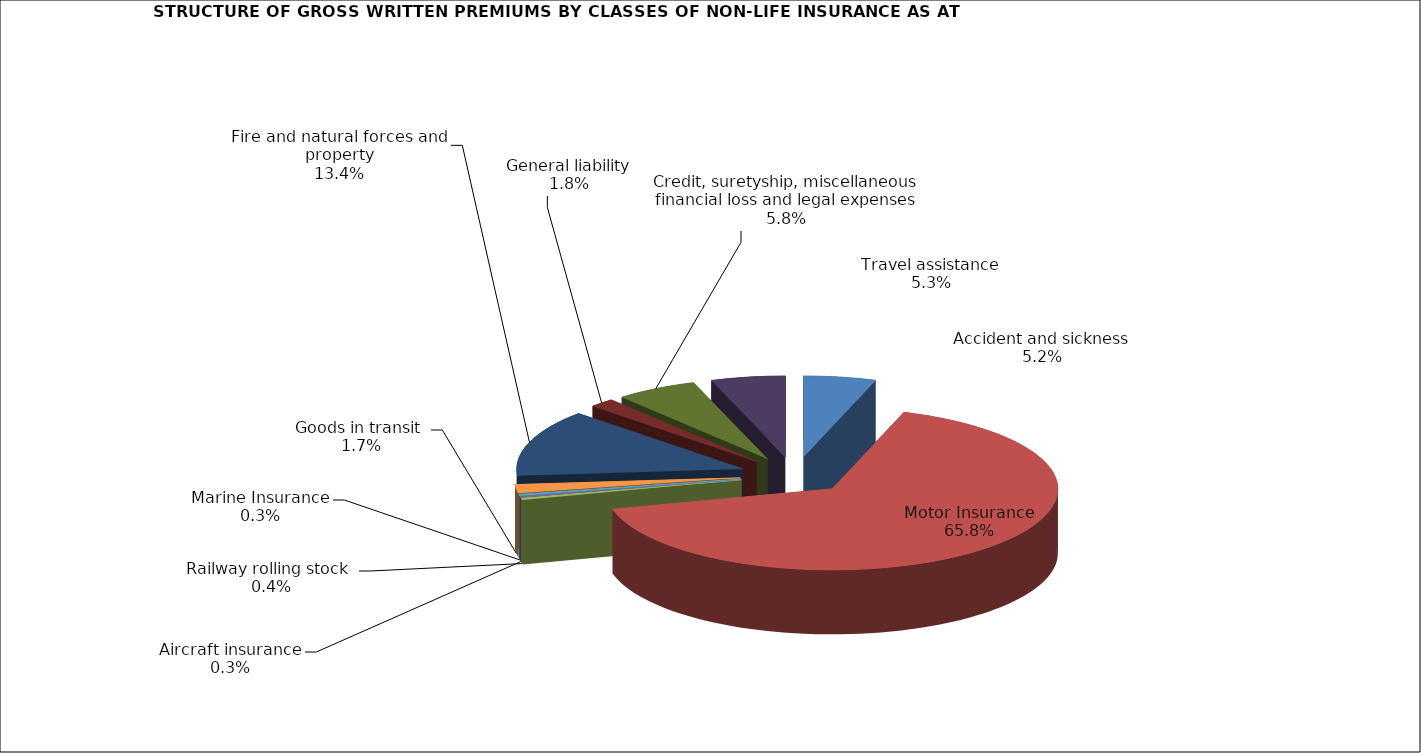
| Category | Accident and sickness |
|---|---|
| Accident and sickness | 0.052 |
| Motor Insurance | 0.658 |
| Railway rolling stock  | 0.004 |
| Aircraft insurance | 0.003 |
| Marine Insurance | 0.003 |
| Goods in transit  | 0.017 |
| Fire and natural forces and property | 0.134 |
| General liability | 0.018 |
| Credit, suretyship, miscellaneous financial loss and legal expenses | 0.058 |
| Travel assistance | 0.053 |